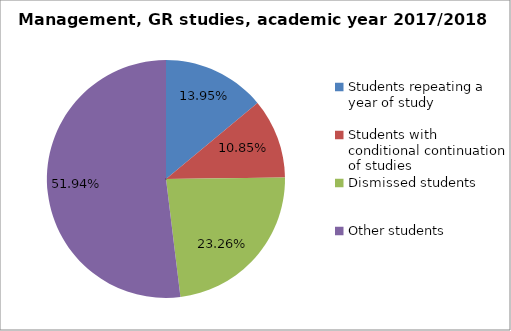
| Category | Series 0 |
|---|---|
| Students repeating a year of study | 18 |
| Students with conditional continuation of studies | 14 |
| Dismissed students | 30 |
| Other students | 67 |